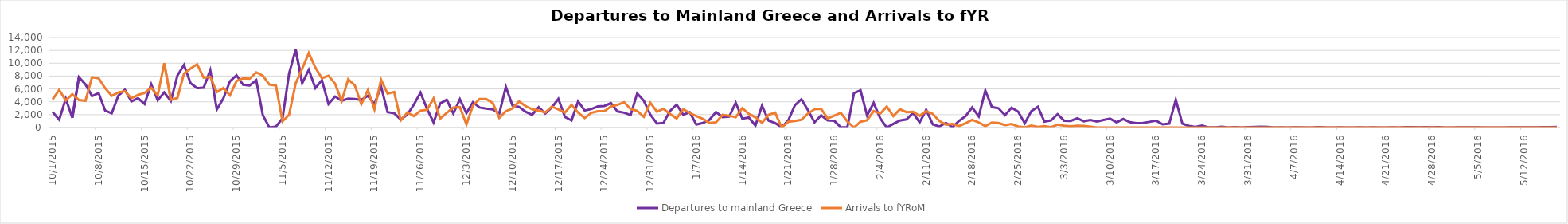
| Category | Departures to mainland Greece | Arrivals to fYRoM |
|---|---|---|
| 10/1/15 | 2409 | 4370 |
| 10/2/15 | 1215 | 5853 |
| 10/3/15 | 4480 | 4202 |
| 10/4/15 | 1513 | 5181 |
| 10/5/15 | 7833 | 4282 |
| 10/6/15 | 6707 | 4156 |
| 10/7/15 | 4886 | 7816 |
| 10/8/15 | 5349 | 7663 |
| 10/9/15 | 2631 | 6107 |
| 10/10/15 | 2214 | 4922 |
| 10/11/15 | 4950 | 5448 |
| 10/12/15 | 5879 | 5645 |
| 10/13/15 | 4052 | 4551 |
| 10/14/15 | 4564 | 5073 |
| 10/15/15 | 3660 | 5373 |
| 10/16/15 | 6743 | 6181 |
| 10/17/15 | 4239 | 4988 |
| 10/18/15 | 5457 | 10005 |
| 10/19/15 | 4119 | 4299 |
| 10/20/15 | 8083 | 4584 |
| 10/21/15 | 9725 | 8384 |
| 10/22/15 | 6896 | 9174 |
| 10/23/15 | 6120 | 9840 |
| 10/24/15 | 6195 | 7752 |
| 10/25/15 | 8916 | 7864 |
| 10/26/15 | 2804 | 5500 |
| 10/27/15 | 4540 | 6146 |
| 10/28/15 | 7191 | 5000 |
| 10/29/15 | 8117 | 7231 |
| 10/30/15 | 6649 | 7663 |
| 10/31/15 | 6537 | 7590 |
| 11/1/15 | 7360 | 8584 |
| 11/2/15 | 1935 | 8075 |
| 11/3/15 | 0 | 6682 |
| 11/4/15 | 142 | 6532 |
| 11/5/15 | 1430 | 960 |
| 11/6/15 | 8392 | 1987 |
| 11/7/15 | 12116 | 6847 |
| 11/8/15 | 6902 | 9148 |
| 11/9/15 | 8977 | 11572 |
| 11/10/15 | 6133 | 9305 |
| 11/11/15 | 7354 | 7651 |
| 11/12/15 | 3650 | 8038 |
| 11/13/15 | 4820 | 6826 |
| 11/14/15 | 4171 | 4107 |
| 11/15/15 | 4497 | 7511 |
| 11/16/15 | 4442 | 6557 |
| 11/17/15 | 4289 | 3621 |
| 11/18/15 | 4927 | 5831 |
| 11/19/15 | 3644 | 2816 |
| 11/20/15 | 6389 | 7453 |
| 11/21/15 | 2401 | 5255 |
| 11/22/15 | 2214 | 5539 |
| 11/23/15 | 1245 | 1113 |
| 11/24/15 | 2006 | 2347 |
| 11/25/15 | 3565 | 1779 |
| 11/26/15 | 5435 | 2617 |
| 11/27/15 | 2932 | 2744 |
| 11/28/15 | 778 | 4520 |
| 11/29/15 | 3736 | 1373 |
| 11/30/15 | 4318 | 2270 |
| 12/1/15 | 2181 | 3094 |
| 12/2/15 | 4384 | 3174 |
| 12/3/15 | 2255 | 494 |
| 12/4/15 | 3934 | 3436 |
| 12/5/15 | 3115 | 4430 |
| 12/6/15 | 2943 | 4425 |
| 12/7/15 | 2810 | 3826 |
| 12/8/15 | 2189 | 1508 |
| 12/9/15 | 6316 | 2550 |
| 12/10/15 | 3456 | 2956 |
| 12/11/15 | 3219 | 4047 |
| 12/12/15 | 2453 | 3338 |
| 12/13/15 | 1976 | 2849 |
| 12/14/15 | 3175 | 2644 |
| 12/15/15 | 2191 | 2349 |
| 12/16/15 | 3137 | 3264 |
| 12/17/15 | 4461 | 2801 |
| 12/18/15 | 1638 | 2332 |
| 12/19/15 | 1110 | 3515 |
| 12/20/15 | 4070 | 2338 |
| 12/21/15 | 2652 | 1470 |
| 12/22/15 | 2864 | 2272 |
| 12/23/15 | 3278 | 2529 |
| 12/24/15 | 3349 | 2529 |
| 12/25/15 | 3806 | 3268 |
| 12/26/15 | 2498 | 3521 |
| 12/27/15 | 2311 | 3938 |
| 12/28/15 | 1946 | 2884 |
| 12/29/15 | 5309 | 2577 |
| 12/30/15 | 4178 | 1665 |
| 12/31/15 | 2009 | 3848 |
| 1/1/16 | 623 | 2454 |
| 1/2/16 | 720 | 2918 |
| 1/3/16 | 2569 | 2112 |
| 1/4/16 | 3563 | 1415 |
| 1/5/16 | 1998 | 2842 |
| 1/6/16 | 2377 | 2258 |
| 1/7/16 | 463 | 1776 |
| 1/8/16 | 716 | 1344 |
| 1/9/16 | 1203 | 715 |
| 1/10/16 | 2417 | 819 |
| 1/11/16 | 1621 | 1959 |
| 1/12/16 | 1701 | 1840 |
| 1/13/16 | 3861 | 1600 |
| 1/14/16 | 1378 | 3022 |
| 1/15/16 | 1551 | 2119 |
| 1/16/16 | 301 | 1598 |
| 1/17/16 | 3378 | 720 |
| 1/18/16 | 1078 | 1980 |
| 1/19/16 | 695 | 2298 |
| 1/20/16 | 50 | 0 |
| 1/21/16 | 1108 | 892 |
| 1/22/16 | 3451 | 1030 |
| 1/23/16 | 4397 | 1208 |
| 1/24/16 | 2706 | 2174 |
| 1/25/16 | 819 | 2836 |
| 1/26/16 | 1887 | 2908 |
| 1/27/16 | 1098 | 1402 |
| 1/28/16 | 1046 | 1837 |
| 1/29/16 | 40 | 2292 |
| 1/30/16 | 53 | 931 |
| 1/31/16 | 5342 | 0 |
| 2/1/16 | 5783 | 908 |
| 2/2/16 | 1878 | 1121 |
| 2/3/16 | 3829 | 2558 |
| 2/4/16 | 1436 | 2173 |
| 2/5/16 | 0 | 3259 |
| 2/6/16 | 578 | 1780 |
| 2/7/16 | 1097 | 2838 |
| 2/8/16 | 1259 | 2392 |
| 2/9/16 | 2283 | 2441 |
| 2/10/16 | 793 | 1817 |
| 2/11/16 | 2756 | 2540 |
| 2/12/16 | 496 | 2115 |
| 2/13/16 | 161 | 1019 |
| 2/14/16 | 724 | 452 |
| 2/15/16 | 65 | 542 |
| 2/16/16 | 1024 | 234 |
| 2/17/16 | 1772 | 668 |
| 2/18/16 | 3118 | 1200 |
| 2/19/16 | 1731 | 799 |
| 2/20/16 | 5738 | 209 |
| 2/21/16 | 3180 | 774 |
| 2/22/16 | 3002 | 714 |
| 2/23/16 | 1927 | 382 |
| 2/24/16 | 3086 | 551 |
| 2/25/16 | 2468 | 168 |
| 2/26/16 | 649 | 20 |
| 2/27/16 | 2525 | 310 |
| 2/28/16 | 3234 | 92 |
| 2/29/16 | 920 | 208 |
| 3/1/16 | 1107 | 30 |
| 3/2/16 | 2073 | 457 |
| 3/3/16 | 1061 | 269 |
| 3/4/16 | 1035 | 177 |
| 3/5/16 | 1444 | 293 |
| 3/6/16 | 980 | 261 |
| 3/7/16 | 1171 | 127 |
| 3/8/16 | 922 | 0 |
| 3/9/16 | 1169 | 0 |
| 3/10/16 | 1381 | 0 |
| 3/11/16 | 810 | 0 |
| 3/12/16 | 1326 | 0 |
| 3/13/16 | 831 | 0 |
| 3/14/16 | 693 | 0 |
| 3/15/16 | 721 | 0 |
| 3/16/16 | 882 | 0 |
| 3/17/16 | 1068 | 0 |
| 3/18/16 | 489 | 0 |
| 3/19/16 | 608 | 0 |
| 3/20/16 | 4314 | 0 |
| 3/21/16 | 616 | 0 |
| 3/22/16 | 254 | 0 |
| 3/23/16 | 95 | 0 |
| 3/24/16 | 316 | 0 |
| 3/25/16 | 22 | 0 |
| 3/26/16 | 25 | 0 |
| 3/27/16 | 113 | 0 |
| 3/28/16 | 0 | 0 |
| 3/29/16 | 76 | 0 |
| 3/30/16 | 11 | 0 |
| 3/31/16 | 68 | 0 |
| 4/1/16 | 102 | 0 |
| 4/2/16 | 132 | 0 |
| 4/3/16 | 105 | 0 |
| 4/4/16 | 0 | 0 |
| 4/5/16 | 31 | 0 |
| 4/6/16 | 7 | 0 |
| 4/7/16 | 32 | 0 |
| 4/8/16 | 17 | 0 |
| 4/9/16 | 14 | 0 |
| 4/10/16 | 16 | 0 |
| 4/11/16 | 64 | 0 |
| 4/12/16 | 5 | 0 |
| 4/13/16 | 10 | 0 |
| 4/14/16 | 36 | 0 |
| 4/15/16 | 0 | 0 |
| 4/16/16 | 0 | 0 |
| 4/17/16 | 34 | 0 |
| 4/18/16 | 9 | 0 |
| 4/19/16 | 39 | 0 |
| 4/20/16 | 7 | 0 |
| 4/21/16 | 7 | 0 |
| 4/22/16 | 16 | 0 |
| 4/23/16 | 0 | 0 |
| 4/24/16 | 51 | 0 |
| 4/25/16 | 54 | 0 |
| 4/26/16 | 17 | 0 |
| 4/27/16 | 52 | 0 |
| 4/28/16 | 16 | 0 |
| 4/29/16 | 56 | 0 |
| 4/30/16 | 4 | 0 |
| 5/1/16 | 0 | 0 |
| 5/2/16 | 25 | 0 |
| 5/3/16 | 34 | 0 |
| 5/4/16 | 41 | 0 |
| 5/5/16 | 37 | 0 |
| 5/6/16 | 1 | 0 |
| 5/7/16 | 0 | 0 |
| 5/8/16 | 0 | 0 |
| 5/9/16 | 5 | 0 |
| 5/10/16 | 46 | 0 |
| 5/11/16 | 40 | 0 |
| 5/12/16 | 39 | 0 |
| 5/13/16 | 31 | 0 |
| 5/14/16 | 22 | 0 |
| 5/15/16 | 75 | 0 |
| 5/16/16 | 51 | 0 |
| 5/17/16 | 88 | 0 |